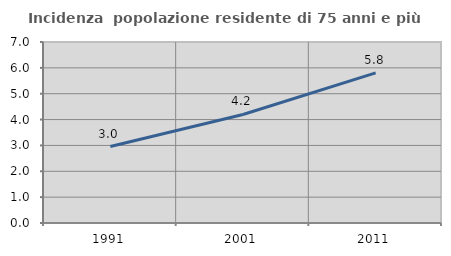
| Category | Incidenza  popolazione residente di 75 anni e più |
|---|---|
| 1991.0 | 2.957 |
| 2001.0 | 4.198 |
| 2011.0 | 5.806 |